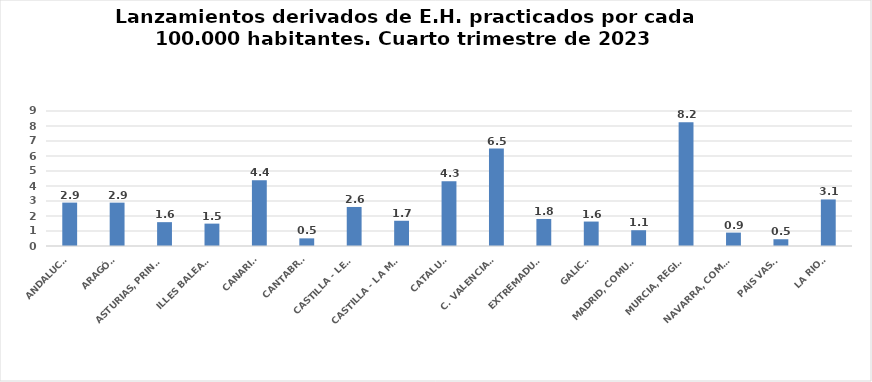
| Category | Series 0 |
|---|---|
| ANDALUCÍA | 2.893 |
| ARAGÓN | 2.89 |
| ASTURIAS, PRINCIPADO | 1.59 |
| ILLES BALEARS | 1.492 |
| CANARIAS | 4.383 |
| CANTABRIA | 0.51 |
| CASTILLA - LEÓN | 2.602 |
| CASTILLA - LA MANCHA | 1.682 |
| CATALUÑA | 4.317 |
| C. VALENCIANA | 6.496 |
| EXTREMADURA | 1.802 |
| GALICIA | 1.63 |
| MADRID, COMUNIDAD | 1.051 |
| MURCIA, REGIÓN | 8.244 |
| NAVARRA, COM. FORAL | 0.893 |
| PAÍS VASCO | 0.45 |
| LA RIOJA | 3.103 |